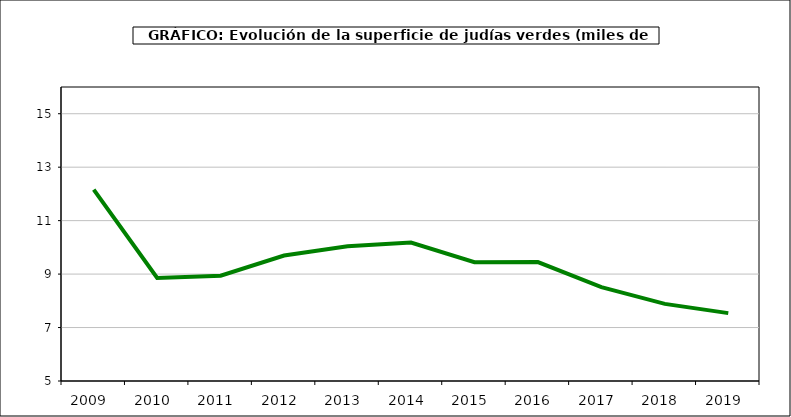
| Category | superficie |
|---|---|
| 2009.0 | 12.162 |
| 2010.0 | 8.857 |
| 2011.0 | 8.939 |
| 2012.0 | 9.694 |
| 2013.0 | 10.041 |
| 2014.0 | 10.18 |
| 2015.0 | 9.445 |
| 2016.0 | 9.45 |
| 2017.0 | 8.509 |
| 2018.0 | 7.885 |
| 2019.0 | 7.54 |